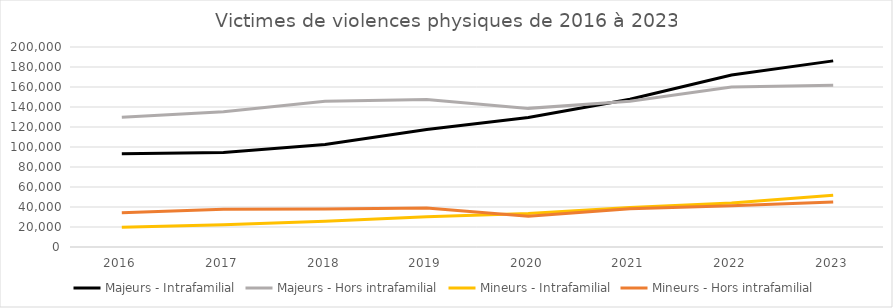
| Category | Majeurs - Intrafamilial | Majeurs - Hors intrafamilial | Mineurs - Intrafamilial | Mineurs - Hors intrafamilial |
|---|---|---|---|---|
| 2016.0 | 93333 | 129845 | 19747 | 34181 |
| 2017.0 | 94486 | 135283 | 22347 | 37663 |
| 2018.0 | 102488 | 145794 | 25774 | 38090 |
| 2019.0 | 117600 | 147591 | 30309 | 38888 |
| 2020.0 | 129591 | 138629 | 33612 | 30822 |
| 2021.0 | 147667 | 145776 | 39467 | 38286 |
| 2022.0 | 172061 | 160010 | 44073 | 41234 |
| 2023.0 | 186131 | 161815 | 51764 | 44954 |